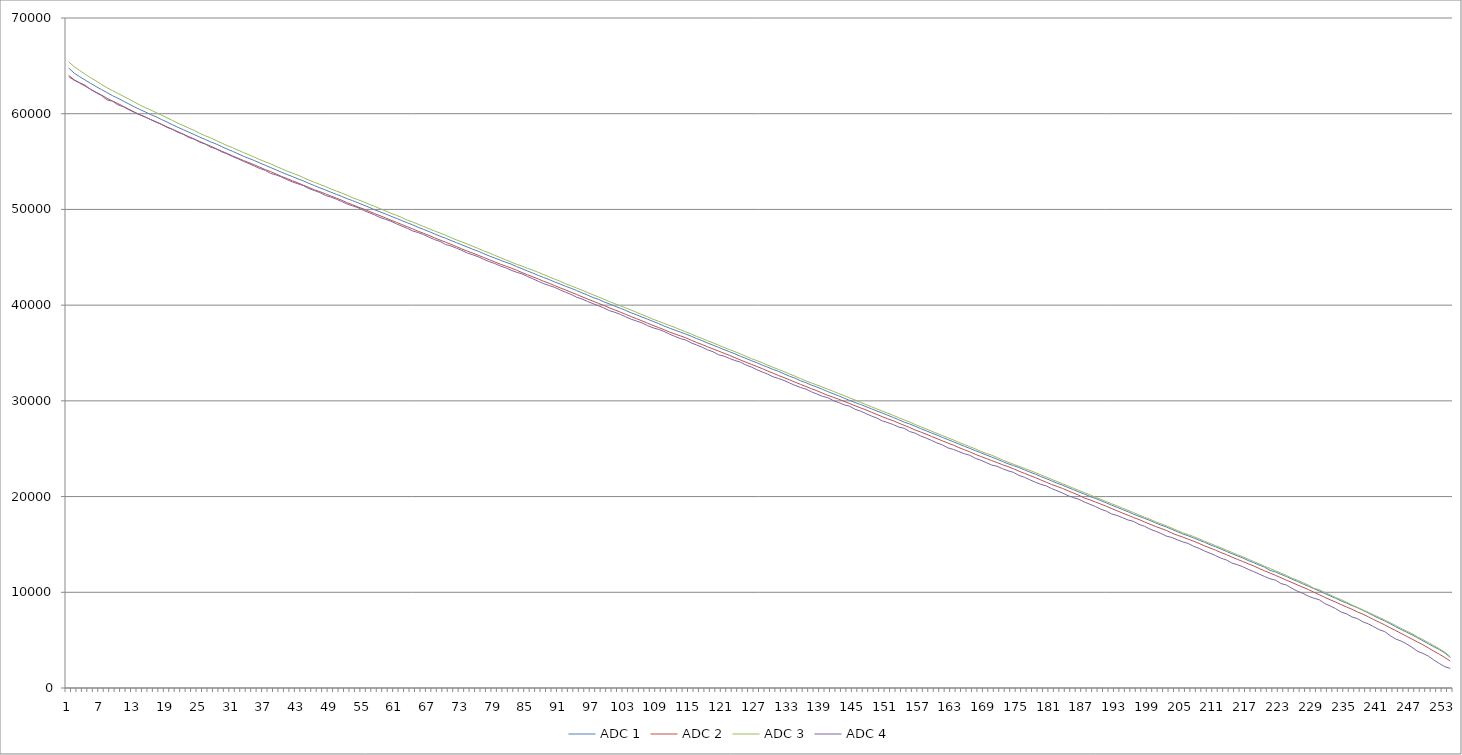
| Category | ADC 1 | ADC 2 | ADC 3 | ADC 4 |
|---|---|---|---|---|
| 0 | 64768 | 64000 | 65408 | 63872 |
| 1 | 64240 | 63552 | 64920 | 63488 |
| 2 | 63872 | 63200 | 64512 | 63240 |
| 3 | 63520 | 62880 | 64128 | 62976 |
| 4 | 63177 | 62560 | 63760 | 62530 |
| 5 | 62840 | 62249 | 63424 | 62208 |
| 6 | 62519 | 61952 | 63064 | 61900 |
| 7 | 62216 | 61616 | 62719 | 61440 |
| 8 | 61888 | 61331 | 62412 | 61312 |
| 9 | 61619 | 61064 | 62120 | 60928 |
| 10 | 61312 | 60768 | 61824 | 60728 |
| 11 | 61024 | 60480 | 61536 | 60416 |
| 12 | 60720 | 60176 | 61224 | 60148 |
| 13 | 60443 | 59888 | 60919 | 59904 |
| 14 | 60192 | 59648 | 60639 | 59672 |
| 15 | 59917 | 59392 | 60392 | 59392 |
| 16 | 59680 | 59160 | 60116 | 59112 |
| 17 | 59392 | 58899 | 59846 | 58880 |
| 18 | 59128 | 58623 | 59578 | 58565 |
| 19 | 58844 | 58368 | 59297 | 58368 |
| 20 | 58576 | 58120 | 59008 | 58056 |
| 21 | 58328 | 57856 | 58764 | 57856 |
| 22 | 58064 | 57600 | 58496 | 57511 |
| 23 | 57820 | 57352 | 58244 | 57344 |
| 24 | 57550 | 57096 | 57952 | 57019 |
| 25 | 57309 | 56840 | 57696 | 56832 |
| 26 | 57056 | 56608 | 57473 | 56504 |
| 27 | 56834 | 56345 | 57200 | 56320 |
| 28 | 56562 | 56090 | 56944 | 56019 |
| 29 | 56308 | 55853 | 56668 | 55808 |
| 30 | 56073 | 55600 | 56449 | 55520 |
| 31 | 55812 | 55356 | 56194 | 55296 |
| 32 | 55552 | 55110 | 55944 | 55024 |
| 33 | 55328 | 54888 | 55712 | 54784 |
| 34 | 55104 | 54658 | 55462 | 54528 |
| 35 | 54848 | 54409 | 55200 | 54272 |
| 36 | 54610 | 54160 | 54976 | 54080 |
| 37 | 54366 | 53946 | 54760 | 53760 |
| 38 | 54126 | 53696 | 54495 | 53600 |
| 39 | 53879 | 53438 | 54253 | 53376 |
| 40 | 53644 | 53224 | 54000 | 53112 |
| 41 | 53424 | 52984 | 53788 | 52864 |
| 42 | 53189 | 52770 | 53568 | 52672 |
| 43 | 52968 | 52522 | 53317 | 52480 |
| 44 | 52720 | 52288 | 53056 | 52176 |
| 45 | 52488 | 52048 | 52840 | 51968 |
| 46 | 52253 | 51852 | 52607 | 51762 |
| 47 | 52033 | 51626 | 52392 | 51456 |
| 48 | 51800 | 51408 | 52144 | 51292 |
| 49 | 51575 | 51186 | 51923 | 51072 |
| 50 | 51360 | 50956 | 51712 | 50821 |
| 51 | 51119 | 50704 | 51479 | 50560 |
| 52 | 50912 | 50488 | 51216 | 50368 |
| 53 | 50681 | 50248 | 51004 | 50176 |
| 54 | 50450 | 50044 | 50794 | 49894 |
| 55 | 50226 | 49802 | 50540 | 49664 |
| 56 | 49968 | 49572 | 50324 | 49431 |
| 57 | 49746 | 49340 | 50080 | 49152 |
| 58 | 49529 | 49116 | 49860 | 48967 |
| 59 | 49293 | 48878 | 49600 | 48768 |
| 60 | 49064 | 48656 | 49392 | 48496 |
| 61 | 48834 | 48421 | 49152 | 48256 |
| 62 | 48608 | 48188 | 48880 | 48026 |
| 63 | 48384 | 47960 | 48680 | 47744 |
| 64 | 48124 | 47719 | 48448 | 47584 |
| 65 | 47912 | 47504 | 48224 | 47360 |
| 66 | 47680 | 47280 | 47976 | 47094 |
| 67 | 47440 | 47032 | 47752 | 46848 |
| 68 | 47202 | 46800 | 47532 | 46656 |
| 69 | 46992 | 46576 | 47304 | 46336 |
| 70 | 46752 | 46354 | 47054 | 46176 |
| 71 | 46528 | 46116 | 46816 | 45952 |
| 72 | 46298 | 45872 | 46604 | 45716 |
| 73 | 46067 | 45648 | 46384 | 45440 |
| 74 | 45841 | 45432 | 46152 | 45257 |
| 75 | 45632 | 45211 | 45917 | 45056 |
| 76 | 45376 | 44976 | 45676 | 44783 |
| 77 | 45144 | 44752 | 45456 | 44544 |
| 78 | 44921 | 44514 | 45208 | 44352 |
| 79 | 44704 | 44288 | 44975 | 44096 |
| 80 | 44480 | 44088 | 44740 | 43906 |
| 81 | 44292 | 43876 | 44504 | 43648 |
| 82 | 44032 | 43656 | 44272 | 43440 |
| 83 | 43806 | 43406 | 44084 | 43264 |
| 84 | 43572 | 43168 | 43844 | 42992 |
| 85 | 43344 | 42956 | 43656 | 42752 |
| 86 | 43104 | 42732 | 43420 | 42491 |
| 87 | 42880 | 42488 | 43192 | 42240 |
| 88 | 42665 | 42280 | 42944 | 42042 |
| 89 | 42422 | 42040 | 42716 | 41856 |
| 90 | 42208 | 41800 | 42488 | 41585 |
| 91 | 41972 | 41584 | 42232 | 41344 |
| 92 | 41760 | 41348 | 42014 | 41117 |
| 93 | 41524 | 41120 | 41788 | 40832 |
| 94 | 41284 | 40880 | 41572 | 40639 |
| 95 | 41056 | 40640 | 41318 | 40384 |
| 96 | 40800 | 40420 | 41088 | 40160 |
| 97 | 40608 | 40192 | 40860 | 39936 |
| 98 | 40344 | 39968 | 40616 | 39708 |
| 99 | 40132 | 39720 | 40383 | 39424 |
| 100 | 39896 | 39508 | 40156 | 39256 |
| 101 | 39680 | 39276 | 39928 | 39040 |
| 102 | 39448 | 39039 | 39712 | 38776 |
| 103 | 39192 | 38804 | 39490 | 38528 |
| 104 | 38984 | 38580 | 39244 | 38336 |
| 105 | 38752 | 38352 | 39008 | 38144 |
| 106 | 38528 | 38110 | 38780 | 37856 |
| 107 | 38304 | 37882 | 38528 | 37632 |
| 108 | 38080 | 37664 | 38318 | 37472 |
| 109 | 37824 | 37440 | 38100 | 37248 |
| 110 | 37598 | 37199 | 37880 | 36976 |
| 111 | 37392 | 36988 | 37676 | 36736 |
| 112 | 37188 | 36792 | 37432 | 36512 |
| 113 | 36976 | 36592 | 37212 | 36352 |
| 114 | 36752 | 36336 | 36976 | 36048 |
| 115 | 36500 | 36096 | 36736 | 35840 |
| 116 | 36288 | 35881 | 36516 | 35598 |
| 117 | 36034 | 35646 | 36272 | 35328 |
| 118 | 35818 | 35424 | 36061 | 35128 |
| 119 | 35584 | 35204 | 35824 | 34816 |
| 120 | 35356 | 34977 | 35584 | 34672 |
| 121 | 35135 | 34753 | 35360 | 34432 |
| 122 | 34912 | 34516 | 35136 | 34214 |
| 123 | 34656 | 34273 | 34912 | 34048 |
| 124 | 34440 | 34048 | 34660 | 33748 |
| 125 | 34200 | 33820 | 34416 | 33536 |
| 126 | 33984 | 33596 | 34208 | 33260 |
| 127 | 33734 | 33365 | 33984 | 33024 |
| 128 | 33514 | 33120 | 33728 | 32792 |
| 129 | 33280 | 32889 | 33496 | 32512 |
| 130 | 33073 | 32640 | 33276 | 32328 |
| 131 | 32820 | 32432 | 33056 | 32128 |
| 132 | 32580 | 32192 | 32807 | 31872 |
| 133 | 32368 | 31960 | 32576 | 31616 |
| 134 | 32102 | 31724 | 32334 | 31396 |
| 135 | 31896 | 31506 | 32088 | 31232 |
| 136 | 31648 | 31264 | 31872 | 30944 |
| 137 | 31444 | 31064 | 31664 | 30720 |
| 138 | 31216 | 30816 | 31440 | 30476 |
| 139 | 30964 | 30576 | 31236 | 30336 |
| 140 | 30744 | 30384 | 30999 | 30032 |
| 141 | 30521 | 30166 | 30770 | 29824 |
| 142 | 30282 | 29952 | 30544 | 29584 |
| 143 | 30050 | 29719 | 30310 | 29440 |
| 144 | 29824 | 29488 | 30090 | 29122 |
| 145 | 29626 | 29270 | 29840 | 28928 |
| 146 | 29392 | 29052 | 29616 | 28672 |
| 147 | 29172 | 28813 | 29384 | 28416 |
| 148 | 28940 | 28576 | 29152 | 28201 |
| 149 | 28726 | 28342 | 28928 | 27904 |
| 150 | 28491 | 28120 | 28704 | 27728 |
| 151 | 28260 | 27920 | 28480 | 27520 |
| 152 | 28030 | 27675 | 28244 | 27264 |
| 153 | 27776 | 27443 | 28008 | 27136 |
| 154 | 27584 | 27216 | 27800 | 26792 |
| 155 | 27346 | 26960 | 27528 | 26624 |
| 156 | 27100 | 26752 | 27304 | 26335 |
| 157 | 26878 | 26520 | 27073 | 26112 |
| 158 | 26640 | 26284 | 26832 | 25871 |
| 159 | 26424 | 26053 | 26608 | 25600 |
| 160 | 26176 | 25821 | 26366 | 25398 |
| 161 | 25952 | 25592 | 26144 | 25088 |
| 162 | 25724 | 25376 | 25920 | 24928 |
| 163 | 25490 | 25114 | 25668 | 24704 |
| 164 | 25256 | 24894 | 25441 | 24473 |
| 165 | 25034 | 24676 | 25208 | 24320 |
| 166 | 24800 | 24424 | 24992 | 24000 |
| 167 | 24581 | 24194 | 24728 | 23808 |
| 168 | 24349 | 23985 | 24521 | 23552 |
| 169 | 24130 | 23768 | 24322 | 23296 |
| 170 | 23904 | 23558 | 24083 | 23168 |
| 171 | 23665 | 23328 | 23830 | 22912 |
| 172 | 23432 | 23136 | 23596 | 22696 |
| 173 | 23240 | 22904 | 23380 | 22528 |
| 174 | 23032 | 22656 | 23169 | 22216 |
| 175 | 22796 | 22431 | 22953 | 22016 |
| 176 | 22562 | 22198 | 22736 | 21760 |
| 177 | 22346 | 21980 | 22504 | 21504 |
| 178 | 22096 | 21744 | 22272 | 21282 |
| 179 | 21872 | 21504 | 22035 | 21120 |
| 180 | 21642 | 21264 | 21802 | 20832 |
| 181 | 21398 | 21058 | 21568 | 20608 |
| 182 | 21192 | 20848 | 21339 | 20368 |
| 183 | 20948 | 20608 | 21104 | 20096 |
| 184 | 20720 | 20368 | 20868 | 19888 |
| 185 | 20472 | 20136 | 20638 | 19712 |
| 186 | 20265 | 19840 | 20416 | 19428 |
| 187 | 20016 | 19662 | 20185 | 19200 |
| 188 | 19808 | 19434 | 19920 | 18960 |
| 189 | 19569 | 19216 | 19720 | 18688 |
| 190 | 19344 | 18992 | 19479 | 18484 |
| 191 | 19100 | 18742 | 19248 | 18176 |
| 192 | 18867 | 18512 | 19024 | 18024 |
| 193 | 18640 | 18272 | 18784 | 17792 |
| 194 | 18416 | 18048 | 18560 | 17552 |
| 195 | 18160 | 17808 | 18320 | 17408 |
| 196 | 17940 | 17600 | 18088 | 17092 |
| 197 | 17728 | 17352 | 17839 | 16896 |
| 198 | 17504 | 17119 | 17640 | 16608 |
| 199 | 17254 | 16880 | 17376 | 16384 |
| 200 | 17028 | 16675 | 17160 | 16155 |
| 201 | 16824 | 16462 | 16944 | 15872 |
| 202 | 16580 | 16191 | 16704 | 15728 |
| 203 | 16336 | 15968 | 16464 | 15488 |
| 204 | 16096 | 15768 | 16224 | 15268 |
| 205 | 15900 | 15554 | 16028 | 15104 |
| 206 | 15681 | 15334 | 15824 | 14800 |
| 207 | 15444 | 15104 | 15586 | 14592 |
| 208 | 15224 | 14848 | 15328 | 14312 |
| 209 | 14974 | 14628 | 15111 | 14080 |
| 210 | 14752 | 14408 | 14876 | 13840 |
| 211 | 14520 | 14155 | 14656 | 13568 |
| 212 | 14272 | 13936 | 14408 | 13376 |
| 213 | 14036 | 13682 | 14168 | 13056 |
| 214 | 13812 | 13442 | 13936 | 12882 |
| 215 | 13584 | 13214 | 13712 | 12672 |
| 216 | 13319 | 12978 | 13456 | 12399 |
| 217 | 13092 | 12752 | 13216 | 12160 |
| 218 | 12847 | 12488 | 12975 | 11904 |
| 219 | 12622 | 12240 | 12720 | 11648 |
| 220 | 12288 | 12004 | 12491 | 11412 |
| 221 | 12124 | 11768 | 12240 | 11264 |
| 222 | 11872 | 11520 | 12008 | 10914 |
| 223 | 11640 | 11264 | 11760 | 10752 |
| 224 | 11376 | 11022 | 11480 | 10417 |
| 225 | 11140 | 10774 | 11264 | 10112 |
| 226 | 10880 | 10530 | 11008 | 9891 |
| 227 | 10640 | 10288 | 10760 | 9600 |
| 228 | 10382 | 10014 | 10432 | 9385 |
| 229 | 10140 | 9752 | 10258 | 9216 |
| 230 | 9872 | 9478 | 9986 | 8833 |
| 231 | 9622 | 9216 | 9730 | 8576 |
| 232 | 9376 | 8976 | 9460 | 8296 |
| 233 | 9102 | 8712 | 9232 | 7936 |
| 234 | 8868 | 8465 | 8968 | 7750 |
| 235 | 8616 | 8224 | 8672 | 7424 |
| 236 | 8384 | 7944 | 8420 | 7248 |
| 237 | 8115 | 7712 | 8152 | 6912 |
| 238 | 7840 | 7436 | 7906 | 6696 |
| 239 | 7536 | 7144 | 7632 | 6400 |
| 240 | 7264 | 6871 | 7376 | 6088 |
| 241 | 7008 | 6595 | 7104 | 5888 |
| 242 | 6720 | 6288 | 6820 | 5472 |
| 243 | 6400 | 6001 | 6529 | 5120 |
| 244 | 6112 | 5700 | 6222 | 4904 |
| 245 | 5832 | 5404 | 5952 | 4608 |
| 246 | 5544 | 5112 | 5672 | 4248 |
| 247 | 5248 | 4808 | 5346 | 3840 |
| 248 | 4926 | 4516 | 5056 | 3614 |
| 249 | 4624 | 4183 | 4736 | 3328 |
| 250 | 4304 | 3844 | 4424 | 2919 |
| 251 | 4008 | 3532 | 4104 | 2560 |
| 252 | 3656 | 3184 | 3744 | 2226 |
| 253 | 3200 | 2816 | 3264 | 2048 |